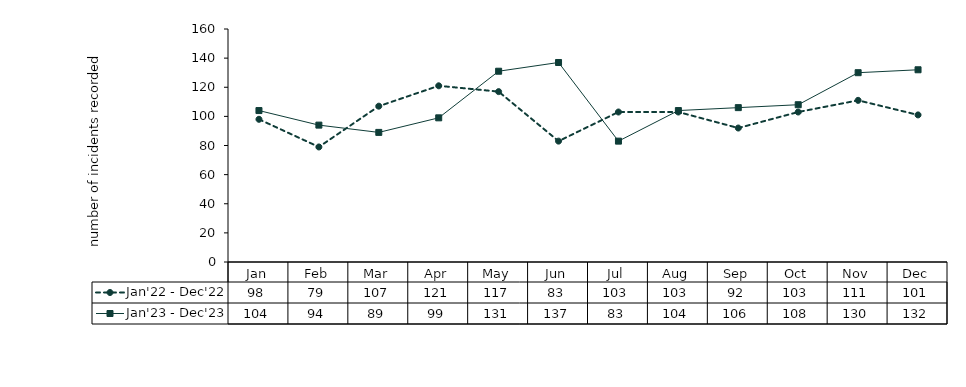
| Category | Jan'22 - Dec'22 | Jan'23 - Dec'23 |
|---|---|---|
| Jan | 98 | 104 |
| Feb | 79 | 94 |
| Mar | 107 | 89 |
| Apr | 121 | 99 |
| May | 117 | 131 |
| Jun | 83 | 137 |
| Jul | 103 | 83 |
| Aug | 103 | 104 |
| Sep | 92 | 106 |
| Oct | 103 | 108 |
| Nov | 111 | 130 |
| Dec | 101 | 132 |